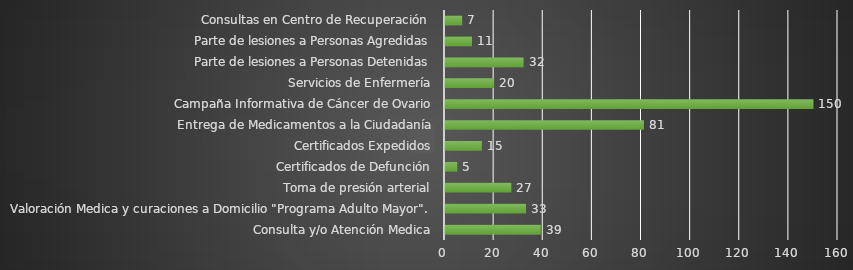
| Category | INDICADOR  |
|---|---|
| Consulta y/o Atención Medica | 39 |
| Valoración Medica y curaciones a Domicilio "Programa Adulto Mayor". | 33 |
| Toma de presión arterial | 27 |
| Certificados de Defunción | 5 |
| Certificados Expedidos | 15 |
| Entrega de Medicamentos a la Ciudadanía | 81 |
| Campaña Informativa de Cáncer de Ovario | 150 |
| Servicios de Enfermería | 20 |
| Parte de lesiones a Personas Detenidas | 32 |
| Parte de lesiones a Personas Agredidas | 11 |
| Consultas en Centro de Recuperación  | 7 |